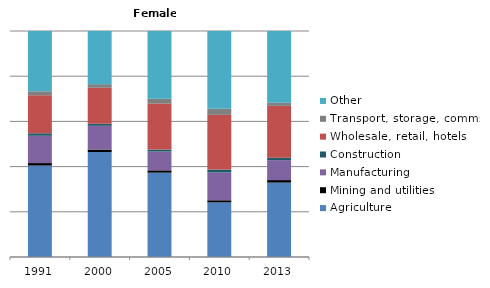
| Category | Agriculture | Mining and utilities | Manufacturing | Construction | Wholesale, retail, hotels | Transport, storage, comms | Other |
|---|---|---|---|---|---|---|---|
| 1991.0 | 40.5 | 1.1 | 12.1 | 1.1 | 16.8 | 1.8 | 26.7 |
| 2000.0 | 46.4 | 1.1 | 10.5 | 0.9 | 15.9 | 1.6 | 23.5 |
| 2005.0 | 37.3 | 1 | 8.3 | 0.9 | 20.3 | 2.2 | 29.9 |
| 2010.0 | 24.2 | 0.9 | 12.3 | 1.3 | 24.2 | 2.7 | 34.4 |
| 2013.0 | 32.9 | 1.1 | 8.8 | 1.1 | 22.9 | 1.4 | 31.7 |